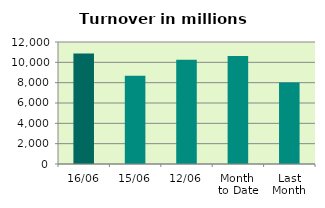
| Category | Series 0 |
|---|---|
| 16/06 | 10862.923 |
| 15/06 | 8677.58 |
| 12/06 | 10262.623 |
| Month 
to Date | 10625.235 |
| Last
Month | 8023.22 |